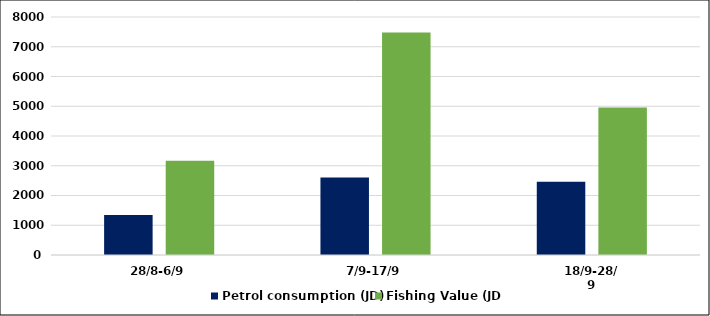
| Category | Petrol consumption (JD) | Fishing Value (JD) |
|---|---|---|
| 28/8-6/9 | 1342 | 3170 |
| 7/9-17/9 | 2605 | 7482 |
| 18/9-28/9 | 2464 | 4962 |